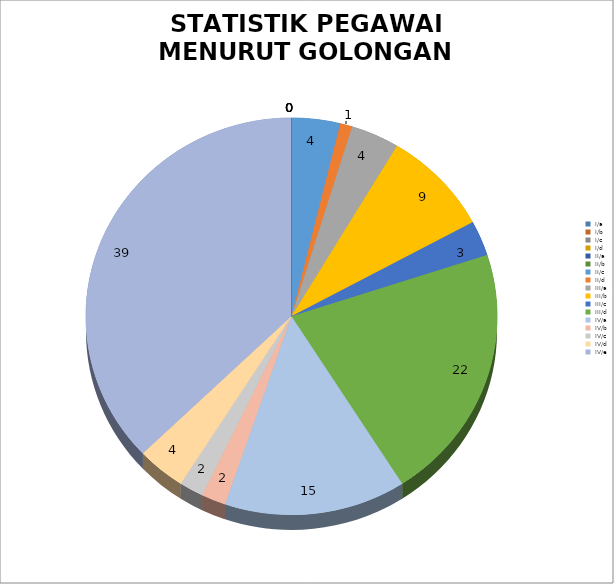
| Category | JUMLAH |
|---|---|
| I/a | 0 |
| I/b | 0 |
| I/c | 0 |
| I/d | 0 |
| II/a | 0 |
| II/b | 0 |
| II/c | 4 |
| II/d | 1 |
| III/a | 4 |
| III/b | 9 |
| III/c | 3 |
| III/d | 22 |
| IV/a | 15 |
| IV/b | 2 |
| IV/c | 2 |
| IV/d | 4 |
| IV/e | 39 |